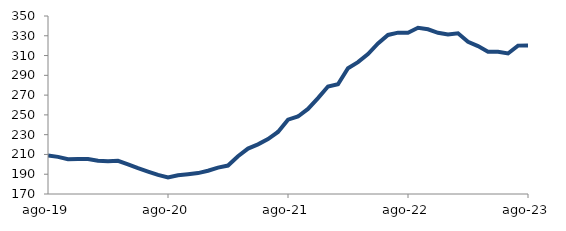
| Category | Series 0 |
|---|---|
| 2019-08-01 | 209.058 |
| 2019-09-01 | 207.556 |
| 2019-10-01 | 205.179 |
| 2019-11-01 | 205.444 |
| 2019-12-01 | 205.45 |
| 2020-01-01 | 203.595 |
| 2020-02-01 | 202.996 |
| 2020-03-01 | 203.606 |
| 2020-04-01 | 199.997 |
| 2020-05-01 | 196.129 |
| 2020-06-01 | 192.644 |
| 2020-07-01 | 189.309 |
| 2020-08-01 | 186.635 |
| 2020-09-01 | 188.903 |
| 2020-10-01 | 189.967 |
| 2020-11-01 | 191.14 |
| 2020-12-01 | 193.522 |
| 2021-01-01 | 196.705 |
| 2021-02-01 | 198.76 |
| 2021-03-01 | 208.155 |
| 2021-04-01 | 215.916 |
| 2021-05-01 | 220.213 |
| 2021-06-01 | 225.532 |
| 2021-07-01 | 232.751 |
| 2021-08-01 | 245.217 |
| 2021-09-01 | 248.367 |
| 2021-10-01 | 256.011 |
| 2021-11-01 | 267.005 |
| 2021-12-01 | 278.738 |
| 2022-01-01 | 281.024 |
| 2022-02-01 | 297.23 |
| 2022-03-01 | 303.362 |
| 2022-04-01 | 311.514 |
| 2022-05-01 | 322.269 |
| 2022-06-01 | 330.847 |
| 2022-07-01 | 333.173 |
| 2022-08-01 | 333.056 |
| 2022-09-01 | 338.053 |
| 2022-10-01 | 336.541 |
| 2022-11-01 | 333.017 |
| 2022-12-01 | 331.349 |
| 2023-01-01 | 332.533 |
| 2023-02-01 | 323.969 |
| 2023-03-01 | 319.613 |
| 2023-04-01 | 313.925 |
| 2023-05-01 | 313.735 |
| 2023-06-01 | 312.115 |
| 2023-07-01 | 320.047 |
| 2023-08-01 | 320.242 |